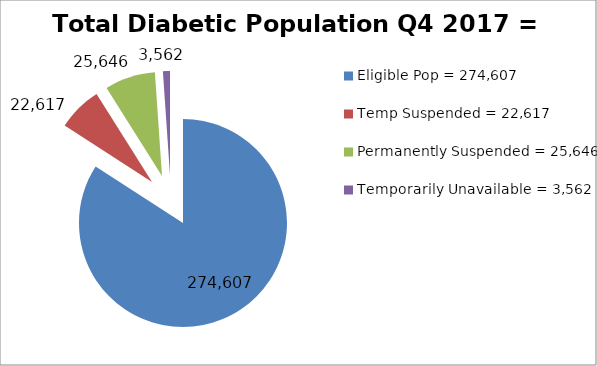
| Category | Total Diabetic Population Q4 2017 = 319,308 |
|---|---|
| Eligible Pop = 274,607 | 274607 |
| Temp Suspended = 22,617 | 22617 |
| Permanently Suspended = 25,646 | 25646 |
| Temporarily Unavailable = 3,562 | 3562 |